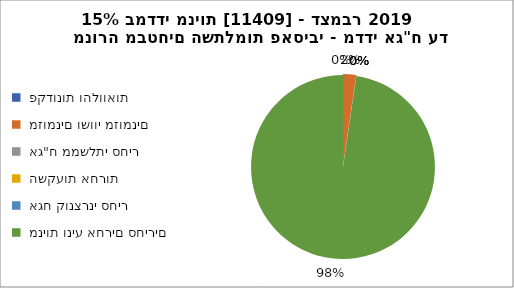
| Category | מנורה מבטחים השתלמות פאסיבי - מדדי אג"ח עד 15% במדדי מניות [11409] - דצמבר 2019 |
|---|---|
|  פקדונות והלוואות  | 0 |
|  מזומנים ושווי מזומנים   | 182 |
|  אג"ח ממשלתי סחיר  | 0 |
|  השקעות אחרות  | 0 |
|  אגח קונצרני סחיר  | 0 |
|  מניות וניע אחרים סחירים   | 7669 |